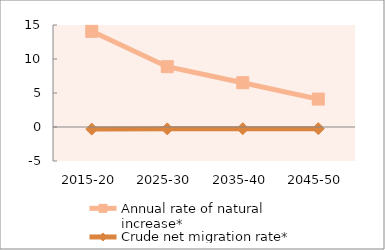
| Category | Annual rate of natural increase* | Crude net migration rate* |
|---|---|---|
| 2015-20 | 14.067 | -0.306 |
| 2025-30 | 8.872 | -0.274 |
| 2035-40 | 6.512 | -0.255 |
| 2045-50 | 4.106 | -0.242 |